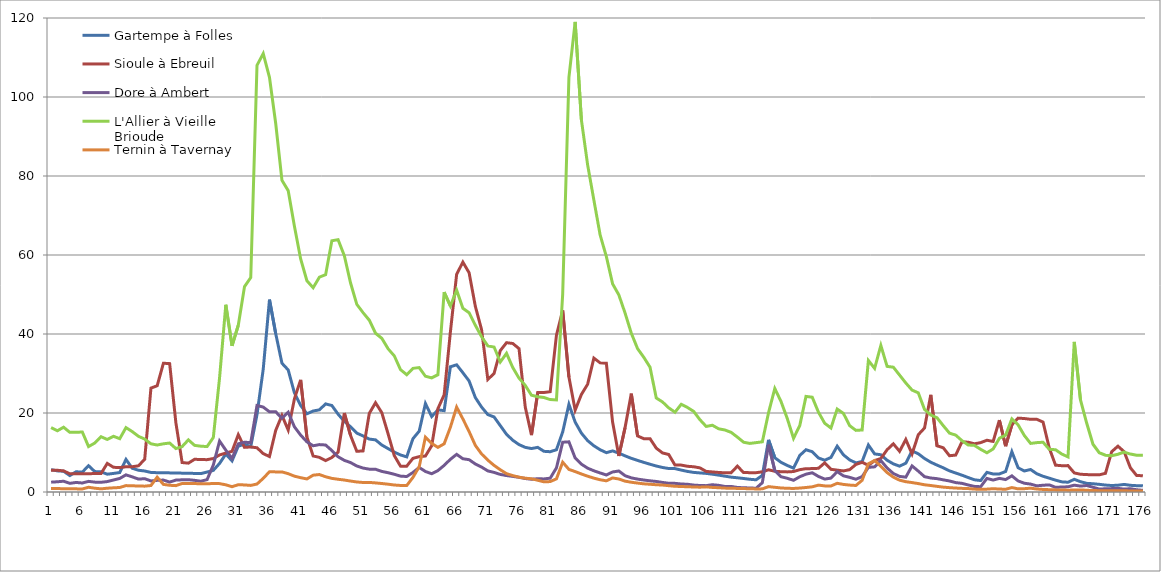
| Category | Gartempe à Folles | Sioule à Ebreuil | Dore à Ambert | L'Allier à Vieille Brioude | Ternin à Tavernay |
|---|---|---|---|---|---|
| 0 | 5.67 | 5.5 | 2.49 | 16.3 | 0.872 |
| 1900-01-01 | 5.35 | 5.5 | 2.59 | 15.5 | 0.864 |
| 1900-01-02 | 5.25 | 5.35 | 2.73 | 16.4 | 0.842 |
| 1900-01-03 | 4.16 | 4.61 | 2.19 | 15.1 | 0.815 |
| 1900-01-04 | 5.12 | 4.6 | 2.42 | 15.1 | 0.795 |
| 1900-01-05 | 5.03 | 4.62 | 2.28 | 15.2 | 0.771 |
| 1900-01-06 | 6.66 | 4.61 | 2.69 | 11.5 | 1.2 |
| 1900-01-07 | 5.17 | 4.69 | 2.5 | 12.4 | 0.959 |
| 1900-01-08 | 5.1 | 4.67 | 2.46 | 14 | 0.797 |
| 1900-01-09 | 4.51 | 7.24 | 2.64 | 13.3 | 0.958 |
| 1900-01-10 | 4.7 | 6.25 | 3.04 | 14.1 | 1.06 |
| 1900-01-11 | 4.93 | 6.19 | 3.43 | 13.5 | 1.14 |
| 1900-01-12 | 8.25 | 6.39 | 4.34 | 16.3 | 1.62 |
| 1900-01-13 | 6.01 | 6.4 | 3.83 | 15.3 | 1.57 |
| 1900-01-14 | 5.51 | 6.63 | 3.27 | 14.1 | 1.52 |
| 1900-01-15 | 5.32 | 8.29 | 3.37 | 13.4 | 1.48 |
| 1900-01-16 | 4.95 | 26.3 | 2.8 | 12.2 | 1.64 |
| 1900-01-17 | 4.89 | 26.9 | 2.95 | 11.9 | 3.75 |
| 1900-01-18 | 4.88 | 32.6 | 3.02 | 12.2 | 1.93 |
| 1900-01-19 | 4.84 | 32.5 | 2.51 | 12.4 | 1.7 |
| 1900-01-20 | 4.83 | 17.5 | 3.01 | 11 | 1.61 |
| 1900-01-21 | 4.77 | 7.46 | 3.09 | 11.5 | 2.16 |
| 1900-01-22 | 4.73 | 7.3 | 3.12 | 13.2 | 2.15 |
| 1900-01-23 | 4.71 | 8.29 | 2.95 | 11.8 | 2.14 |
| 1900-01-24 | 4.66 | 8.21 | 2.73 | 11.6 | 2.07 |
| 1900-01-25 | 5.05 | 8.19 | 3.13 | 11.5 | 2.07 |
| 1900-01-26 | 5.47 | 8.47 | 6.83 | 13.8 | 2.16 |
| 1900-01-27 | 7.24 | 9.38 | 12.9 | 28.9 | 2.12 |
| 1900-01-28 | 9.61 | 9.85 | 10.6 | 47.4 | 1.82 |
| 1900-01-29 | 7.88 | 10.3 | 8.48 | 37 | 1.34 |
| 1900-01-30 | 11.6 | 14.5 | 12.2 | 42.2 | 1.85 |
| 1900-01-31 | 12.1 | 11.3 | 12.6 | 52 | 1.79 |
| 1900-02-01 | 11.5 | 11.4 | 12.5 | 54.3 | 1.67 |
| 1900-02-02 | 19.6 | 11.2 | 21.9 | 108 | 2.02 |
| 1900-02-03 | 31.1 | 9.72 | 21.5 | 111 | 3.46 |
| 1900-02-04 | 48.7 | 8.98 | 20.3 | 105 | 5.13 |
| 1900-02-05 | 40.1 | 15.6 | 20.3 | 93.3 | 5.09 |
| 1900-02-06 | 32.6 | 19.4 | 18.7 | 78.9 | 5.09 |
| 1900-02-07 | 30.9 | 15.7 | 20.2 | 76.3 | 4.64 |
| 1900-02-08 | 25.1 | 23.6 | 16.5 | 67.3 | 4.01 |
| 1900-02-09 | 21.9 | 28.4 | 14.4 | 59 | 3.62 |
| 1900-02-10 | 19.8 | 13.9 | 12.7 | 53.5 | 3.31 |
| 1900-02-11 | 20.5 | 9.12 | 11.7 | 51.7 | 4.26 |
| 1900-02-12 | 20.8 | 8.78 | 12 | 54.4 | 4.42 |
| 1900-02-13 | 22.3 | 7.93 | 11.9 | 55 | 3.86 |
| 1900-02-14 | 21.9 | 8.74 | 10.5 | 63.6 | 3.45 |
| 1900-02-15 | 19.7 | 10.1 | 8.92 | 63.9 | 3.22 |
| 1900-02-16 | 17.9 | 20 | 8.01 | 59.8 | 3.03 |
| 1900-02-17 | 16.5 | 14.3 | 7.45 | 52.9 | 2.77 |
| 1900-02-18 | 14.9 | 10.3 | 6.58 | 47.5 | 2.54 |
| 1900-02-19 | 14.2 | 10.4 | 6.06 | 45.4 | 2.41 |
| 1900-02-20 | 13.4 | 19.9 | 5.78 | 43.5 | 2.43 |
| 1900-02-21 | 13.2 | 22.6 | 5.76 | 40.2 | 2.3 |
| 1900-02-22 | 11.9 | 20.1 | 5.21 | 38.9 | 2.15 |
| 1900-02-23 | 11 | 14.8 | 4.89 | 36.3 | 1.98 |
| 1900-02-24 | 10.1 | 9.24 | 4.49 | 34.5 | 1.77 |
| 1900-02-25 | 9.38 | 6.55 | 4.02 | 31 | 1.66 |
| 1900-02-26 | 8.89 | 6.54 | 3.92 | 29.7 | 1.63 |
| 1900-02-27 | 13.5 | 8.52 | 4.94 | 31.3 | 3.7 |
| 1900-02-28 | 15.4 | 8.95 | 6.22 | 31.5 | 6.4 |
| 1900-02-28 | 22.4 | 9.11 | 5.19 | 29.3 | 13.9 |
| 1900-03-01 | 19.1 | 11.7 | 4.63 | 28.9 | 12.3 |
| 1900-03-02 | 20.8 | 21.1 | 5.42 | 29.7 | 11.3 |
| 1900-03-03 | 20.6 | 24.6 | 6.74 | 50.6 | 12.2 |
| 1900-03-04 | 31.7 | 40.5 | 8.28 | 47.1 | 16.4 |
| 1900-03-05 | 32.2 | 55.1 | 9.53 | 51.1 | 21.5 |
| 1900-03-06 | 30.2 | 58.2 | 8.42 | 46.5 | 18.5 |
| 1900-03-07 | 28.1 | 55.5 | 8.18 | 45.4 | 15.3 |
| 1900-03-08 | 23.9 | 47 | 7.09 | 42.2 | 11.8 |
| 1900-03-09 | 21.5 | 41.1 | 6.31 | 39.3 | 9.63 |
| 1900-03-10 | 19.6 | 28.5 | 5.34 | 37 | 8.06 |
| 1900-03-11 | 19 | 30 | 4.96 | 36.7 | 6.74 |
| 1900-03-12 | 16.8 | 35.8 | 4.45 | 32.9 | 5.63 |
| 1900-03-13 | 14.6 | 37.8 | 4.16 | 35.1 | 4.64 |
| 1900-03-14 | 13.1 | 37.6 | 3.95 | 31.5 | 4.15 |
| 1900-03-15 | 12 | 36.3 | 3.72 | 28.8 | 3.75 |
| 1900-03-16 | 11.3 | 21.5 | 3.41 | 27 | 3.5 |
| 1900-03-17 | 11 | 14.4 | 3.23 | 24.5 | 3.34 |
| 1900-03-18 | 11.3 | 25.2 | 3.36 | 24.1 | 2.98 |
| 1900-03-19 | 10.3 | 25.2 | 3.31 | 23.9 | 2.57 |
| 1900-03-20 | 10.2 | 25.4 | 3.5 | 23.4 | 2.64 |
| 1900-03-21 | 10.7 | 39.7 | 6.11 | 23.3 | 3.33 |
| 1900-03-22 | 15.2 | 46 | 12.6 | 50.1 | 7.54 |
| 1900-03-23 | 22.2 | 29.1 | 12.7 | 105 | 5.72 |
| 1900-03-24 | 17.7 | 20.7 | 8.6 | 119 | 5.17 |
| 1900-03-25 | 14.9 | 24.7 | 7.05 | 94.2 | 4.56 |
| 1900-03-26 | 13 | 27.3 | 6.03 | 82.8 | 4 |
| 1900-03-27 | 11.7 | 33.9 | 5.37 | 73.9 | 3.51 |
| 1900-03-28 | 10.7 | 32.7 | 4.82 | 65.1 | 3.1 |
| 1900-03-29 | 9.96 | 32.6 | 4.31 | 59.6 | 2.83 |
| 1900-03-30 | 10.4 | 17.7 | 5.07 | 52.7 | 3.56 |
| 1900-03-31 | 9.85 | 9.12 | 5.32 | 49.9 | 3.29 |
| 1900-04-01 | 9.15 | 16.3 | 4.13 | 45.3 | 2.75 |
| 1900-04-02 | 8.52 | 24.9 | 3.58 | 40.2 | 2.47 |
| 1900-04-03 | 8 | 14.2 | 3.27 | 36.3 | 2.26 |
| 1900-04-04 | 7.5 | 13.5 | 3.03 | 34.1 | 2.07 |
| 1900-04-05 | 7.03 | 13.5 | 2.83 | 31.6 | 1.96 |
| 1900-04-06 | 6.58 | 11.1 | 2.67 | 23.8 | 1.84 |
| 1900-04-07 | 6.21 | 9.89 | 2.42 | 22.8 | 1.76 |
| 1900-04-08 | 5.94 | 9.49 | 2.21 | 21.3 | 1.6 |
| 1900-04-09 | 5.92 | 6.81 | 2.19 | 20.2 | 1.45 |
| 1900-04-10 | 5.55 | 6.81 | 2.03 | 22.2 | 1.39 |
| 1900-04-11 | 5.21 | 6.51 | 1.96 | 21.4 | 1.33 |
| 1900-04-12 | 4.96 | 6.39 | 1.75 | 20.4 | 1.27 |
| 1900-04-13 | 4.83 | 6.11 | 1.65 | 18.3 | 1.22 |
| 1900-04-14 | 4.71 | 5.21 | 1.61 | 16.6 | 1.3 |
| 1900-04-15 | 4.51 | 5.08 | 1.84 | 16.9 | 1.16 |
| 1900-04-16 | 4.27 | 4.95 | 1.69 | 16 | 1.08 |
| 1900-04-17 | 4.01 | 4.86 | 1.4 | 15.7 | 0.984 |
| 1900-04-18 | 3.76 | 4.87 | 1.41 | 15.1 | 0.95 |
| 1900-04-19 | 3.6 | 6.54 | 1.15 | 13.9 | 0.905 |
| 1900-04-20 | 3.42 | 4.92 | 1.07 | 12.6 | 0.873 |
| 1900-04-21 | 3.22 | 4.9 | 1.02 | 12.3 | 0.817 |
| 1900-04-22 | 3.09 | 4.89 | 0.954 | 12.5 | 0.781 |
| 1900-04-23 | 4.2 | 5.11 | 2.35 | 12.7 | 0.793 |
| 1900-04-24 | 13.2 | 5.63 | 12 | 20.1 | 1.36 |
| 1900-04-25 | 8.68 | 5.24 | 5.44 | 26.2 | 1.19 |
| 1900-04-26 | 7.51 | 5.14 | 3.87 | 22.9 | 1.02 |
| 1900-04-27 | 6.72 | 5.09 | 3.47 | 18.6 | 0.938 |
| 1900-04-28 | 6.04 | 5.18 | 2.96 | 13.6 | 0.899 |
| 1900-04-29 | 9.25 | 5.65 | 3.86 | 16.8 | 0.995 |
| 1900-04-30 | 10.7 | 5.91 | 4.51 | 24.2 | 1.14 |
| 1900-05-01 | 10.2 | 5.92 | 4.87 | 24 | 1.31 |
| 1900-05-02 | 8.62 | 6 | 3.94 | 20.2 | 1.74 |
| 1900-05-03 | 8.04 | 7.38 | 3.27 | 17.4 | 1.55 |
| 1900-05-04 | 8.75 | 5.74 | 3.51 | 16.2 | 1.52 |
| 1900-05-05 | 11.6 | 5.54 | 5.16 | 21 | 2.2 |
| 1900-05-06 | 9.41 | 5.34 | 4.09 | 19.9 | 1.92 |
| 1900-05-07 | 8.13 | 5.66 | 3.71 | 16.8 | 1.75 |
| 1900-05-08 | 7.37 | 6.97 | 3.23 | 15.6 | 1.65 |
| 1900-05-09 | 7.73 | 7.52 | 3.9 | 15.7 | 2.97 |
| 1900-05-10 | 11.9 | 6.74 | 6.24 | 33.3 | 7.14 |
| 1900-05-11 | 9.64 | 7.95 | 6.37 | 31.3 | 7.98 |
| 1900-05-12 | 9.43 | 8.48 | 7.96 | 37.1 | 6.51 |
| 1900-05-13 | 8.04 | 10.7 | 6.08 | 31.8 | 4.91 |
| 1900-05-14 | 7.12 | 12.2 | 4.69 | 31.6 | 3.76 |
| 1900-05-15 | 6.54 | 10.3 | 3.95 | 29.6 | 3 |
| 1900-05-16 | 7.3 | 13.3 | 3.76 | 27.6 | 2.61 |
| 1900-05-17 | 10.4 | 9.63 | 6.6 | 25.8 | 2.39 |
| 1900-05-18 | 9.68 | 14.5 | 5.29 | 25.1 | 2.13 |
| 1900-05-19 | 8.48 | 16.2 | 3.88 | 20.9 | 1.83 |
| 1900-05-20 | 7.54 | 24.6 | 3.54 | 19.5 | 1.64 |
| 1900-05-21 | 6.81 | 11.7 | 3.38 | 18.8 | 1.43 |
| 1900-05-22 | 6.13 | 11.2 | 3.08 | 16.8 | 1.23 |
| 1900-05-23 | 5.35 | 9.18 | 2.79 | 14.9 | 1.1 |
| 1900-05-24 | 4.8 | 9.35 | 2.38 | 14.4 | 0.998 |
| 1900-05-25 | 4.26 | 12.7 | 2.19 | 13 | 0.92 |
| 1900-05-26 | 3.66 | 12.6 | 1.78 | 11.9 | 0.869 |
| 1900-05-27 | 3.09 | 12.2 | 1.41 | 11.8 | 0.735 |
| 1900-05-28 | 2.9 | 12.5 | 1.34 | 10.8 | 0.696 |
| 1900-05-29 | 4.97 | 13.1 | 3.44 | 9.93 | 0.725 |
| 1900-05-30 | 4.56 | 12.8 | 3.02 | 10.9 | 0.839 |
| 1900-05-31 | 4.58 | 18.2 | 3.45 | 13.6 | 0.748 |
| 1900-06-01 | 5.19 | 11.6 | 3.15 | 14.4 | 0.696 |
| 1900-06-02 | 10.2 | 17 | 4.09 | 18.5 | 1.12 |
| 1900-06-03 | 6.13 | 18.7 | 2.8 | 17 | 0.794 |
| 1900-06-04 | 5.33 | 18.6 | 2.22 | 14.3 | 0.842 |
| 1900-06-05 | 5.69 | 18.4 | 2 | 12.3 | 0.962 |
| 1900-06-06 | 4.62 | 18.4 | 1.56 | 12.5 | 0.756 |
| 1900-06-07 | 3.98 | 17.7 | 1.71 | 12.6 | 0.649 |
| 1900-06-08 | 3.5 | 11.1 | 1.8 | 10.8 | 0.589 |
| 1900-06-09 | 3 | 6.79 | 1.19 | 10.7 | 0.536 |
| 1900-06-10 | 2.57 | 6.66 | 1.26 | 9.61 | 0.534 |
| 1900-06-11 | 2.47 | 6.68 | 1.32 | 8.89 | 0.459 |
| 1900-06-12 | 3.21 | 4.83 | 1.73 | 38 | 0.502 |
| 1900-06-13 | 2.61 | 4.49 | 1.5 | 23.3 | 0.53 |
| 1900-06-14 | 2.19 | 4.41 | 1.64 | 17.4 | 0.441 |
| 1900-06-15 | 2.09 | 4.34 | 1.2 | 12.1 | 0.361 |
| 1900-06-16 | 1.94 | 4.34 | 0.748 | 9.94 | 0.34 |
| 1900-06-17 | 1.76 | 4.73 | 0.813 | 9.33 | 0.336 |
| 1900-06-18 | 1.64 | 10.2 | 0.857 | 9.21 | 0.33 |
| 1900-06-19 | 1.72 | 11.6 | 0.92 | 9.55 | 0.307 |
| 1900-06-20 | 1.92 | 10.2 | 0.727 | 10.1 | 0.302 |
| 1900-06-21 | 1.69 | 6.13 | 0.836 | 9.6 | 0.272 |
| 1900-06-22 | 1.6 | 4.18 | 0.57 | 9.3 | 0.267 |
| 1900-06-23 | 1.55 | 4.12 | 0.422 | 9.3 | 0.26 |